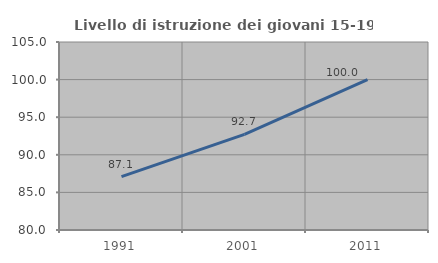
| Category | Livello di istruzione dei giovani 15-19 anni |
|---|---|
| 1991.0 | 87.097 |
| 2001.0 | 92.708 |
| 2011.0 | 100 |